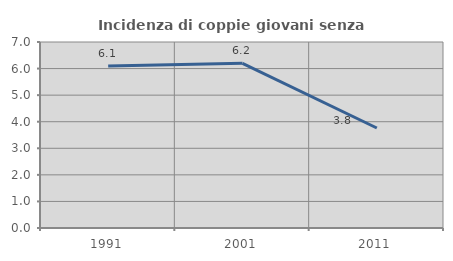
| Category | Incidenza di coppie giovani senza figli |
|---|---|
| 1991.0 | 6.1 |
| 2001.0 | 6.196 |
| 2011.0 | 3.764 |